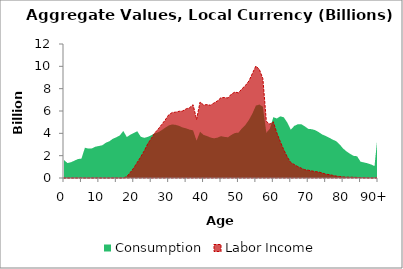
| Category | Consumption | Labor Income |
|---|---|---|
| 0 | 1608.636 | 0 |
|  | 1337.954 | 0 |
| 2 | 1412.718 | 0 |
| 3 | 1555.44 | 0 |
| 4 | 1695.877 | 0 |
| 5 | 1737.425 | 0 |
| 6 | 2713.762 | 0 |
| 7 | 2630.106 | 0 |
| 8 | 2653.344 | 0 |
| 9 | 2800.683 | 0 |
| 10 | 2866.25 | 0 |
| 11 | 2935.911 | 0 |
| 12 | 3158.695 | 0 |
| 13 | 3287.694 | 0 |
| 14 | 3515.169 | 0 |
| 15 | 3646.069 | 0 |
| 16 | 3814.289 | 0.955 |
| 17 | 4211.477 | 6.173 |
| 18 | 3670.633 | 122.564 |
| 19 | 3877.49 | 494.152 |
| 20 | 4035.013 | 903.236 |
| 21 | 4186.886 | 1400.282 |
| 22 | 3697.456 | 1896.563 |
| 23 | 3598.314 | 2434.184 |
| 24 | 3677.792 | 3058.107 |
| 25 | 3827.475 | 3537.82 |
| 26 | 4002.773 | 4025.667 |
| 27 | 4098.646 | 4380.676 |
| 28 | 4284.421 | 4788.375 |
| 29 | 4504.132 | 5191.459 |
| 30 | 4701.471 | 5653.737 |
| 31 | 4798.317 | 5857.866 |
| 32 | 4759.347 | 5898.553 |
| 33 | 4666.799 | 5973.892 |
| 34 | 4525.404 | 6002.284 |
| 35 | 4446.538 | 6188.447 |
| 36 | 4331.289 | 6295.31 |
| 37 | 4264.257 | 6562.008 |
| 38 | 3341.648 | 5251.92 |
| 39 | 4143.194 | 6807.042 |
| 40 | 3858.42 | 6539.258 |
| 41 | 3756.642 | 6568.977 |
| 42 | 3623.516 | 6520.012 |
| 43 | 3555.562 | 6717.953 |
| 44 | 3614.75 | 6910.862 |
| 45 | 3747.997 | 7192.497 |
| 46 | 3680.452 | 7205.019 |
| 47 | 3648.395 | 7169.192 |
| 48 | 3862.961 | 7522.029 |
| 49 | 4033.005 | 7695.558 |
| 50 | 4062.352 | 7625.46 |
| 51 | 4442.326 | 7984.24 |
| 52 | 4760.893 | 8286.282 |
| 53 | 5199.179 | 8687.676 |
| 54 | 5775.048 | 9364.437 |
| 55 | 6485.092 | 10031.512 |
| 56 | 6579.464 | 9712.953 |
| 57 | 6386.235 | 8902.626 |
| 58 | 4050.676 | 5068.044 |
| 59 | 4418.224 | 4818.185 |
| 60 | 5449.395 | 5034.887 |
| 61 | 5329.207 | 4041.582 |
| 62 | 5524.949 | 3255.728 |
| 63 | 5436.368 | 2518.893 |
| 64 | 4969.15 | 1889.612 |
| 65 | 4325.433 | 1376.645 |
| 66 | 4664.428 | 1206.066 |
| 67 | 4812.01 | 1025.15 |
| 68 | 4821.163 | 882.506 |
| 69 | 4629.197 | 741.56 |
| 70 | 4401.474 | 700.099 |
| 71 | 4371.241 | 634.96 |
| 72 | 4283.231 | 569.786 |
| 73 | 4110.443 | 538.445 |
| 74 | 3899.1 | 450.322 |
| 75 | 3765.458 | 347.884 |
| 76 | 3613.457 | 302.792 |
| 77 | 3438.947 | 241.128 |
| 78 | 3299.114 | 170.361 |
| 79 | 3009.74 | 135.534 |
| 80 | 2640.823 | 95.701 |
| 81 | 2377.713 | 74.583 |
| 82 | 2165.29 | 71.519 |
| 83 | 1983.818 | 63.742 |
| 84 | 1948.845 | 48.964 |
| 85 | 1462.303 | 29.599 |
| 86 | 1391.179 | 19.219 |
| 87 | 1318.819 | 8.451 |
| 88 | 1214.311 | 3.605 |
| 89 | 1065.617 | 3.211 |
| 90+ | 4142.46 | 12.658 |